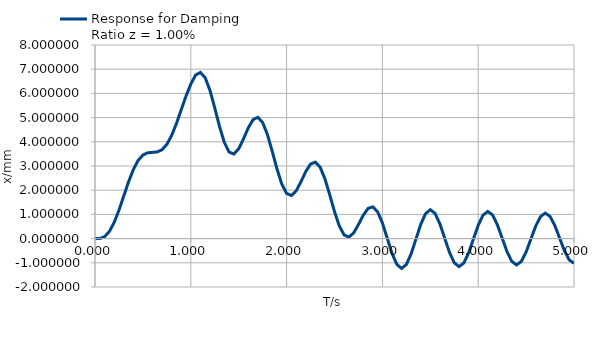
| Category | Response for Damping Ratio z = 1.00% |
|---|---|
| 0.0 | 0 |
| 0.05 | 0 |
| 0.1 | 0.079 |
| 0.15 | 0.295 |
| 0.2 | 0.667 |
| 0.25 | 1.174 |
| 0.3 | 1.759 |
| 0.35 | 2.344 |
| 0.4 | 2.852 |
| 0.45 | 3.228 |
| 0.5 | 3.452 |
| 0.55 | 3.545 |
| 0.6 | 3.563 |
| 0.65 | 3.581 |
| 0.7 | 3.674 |
| 0.75 | 3.894 |
| 0.8 | 4.262 |
| 0.85 | 4.756 |
| 0.9 | 5.323 |
| 0.95 | 5.891 |
| 1.0 | 6.386 |
| 1.05 | 6.757 |
| 1.1 | 6.867 |
| 1.15 | 6.649 |
| 1.2 | 6.126 |
| 1.25 | 5.4 |
| 1.3 | 4.628 |
| 1.35 | 3.976 |
| 1.4 | 3.577 |
| 1.45 | 3.495 |
| 1.5 | 3.71 |
| 1.55 | 4.121 |
| 1.6 | 4.577 |
| 1.65 | 4.917 |
| 1.7 | 5.011 |
| 1.75 | 4.798 |
| 1.8 | 4.297 |
| 1.85 | 3.607 |
| 1.9 | 2.872 |
| 1.95 | 2.251 |
| 2.0 | 1.867 |
| 2.05 | 1.781 |
| 2.1 | 1.973 |
| 2.15 | 2.35 |
| 2.2 | 2.769 |
| 2.25 | 3.08 |
| 2.3 | 3.159 |
| 2.35 | 2.95 |
| 2.4 | 2.471 |
| 2.45 | 1.814 |
| 2.5 | 1.115 |
| 2.55 | 0.522 |
| 2.6 | 0.153 |
| 2.65 | 0.063 |
| 2.7 | 0.234 |
| 2.75 | 0.579 |
| 2.8 | 0.964 |
| 2.85 | 1.246 |
| 2.9 | 1.312 |
| 2.95 | 1.107 |
| 3.0 | 0.648 |
| 3.05 | 0.022 |
| 3.1 | -0.604 |
| 3.15 | -1.062 |
| 3.2 | -1.232 |
| 3.25 | -1.072 |
| 3.3 | -0.628 |
| 3.35 | -0.021 |
| 3.4 | 0.585 |
| 3.45 | 1.029 |
| 3.5 | 1.194 |
| 3.55 | 1.039 |
| 3.6 | 0.609 |
| 3.64999999999999 | 0.021 |
| 3.69999999999999 | -0.567 |
| 3.74999999999999 | -0.997 |
| 3.79999999999999 | -1.157 |
| 3.84999999999999 | -1.007 |
| 3.89999999999999 | -0.59 |
| 3.94999999999999 | -0.02 |
| 3.99999999999999 | 0.549 |
| 4.04999999999999 | 0.966 |
| 4.09999999999999 | 1.122 |
| 4.14999999999999 | 0.976 |
| 4.19999999999999 | 0.572 |
| 4.24999999999999 | 0.02 |
| 4.29999999999999 | -0.532 |
| 4.34999999999999 | -0.936 |
| 4.39999999999999 | -1.087 |
| 4.44999999999999 | -0.946 |
| 4.49999999999999 | -0.555 |
| 4.54999999999999 | -0.019 |
| 4.59999999999999 | 0.516 |
| 4.64999999999999 | 0.907 |
| 4.69999999999999 | 1.053 |
| 4.74999999999999 | 0.917 |
| 4.79999999999999 | 0.538 |
| 4.84999999999999 | 0.019 |
| 4.89999999999999 | -0.499 |
| 4.94999999999999 | -0.879 |
| 4.99999999999999 | -1.021 |